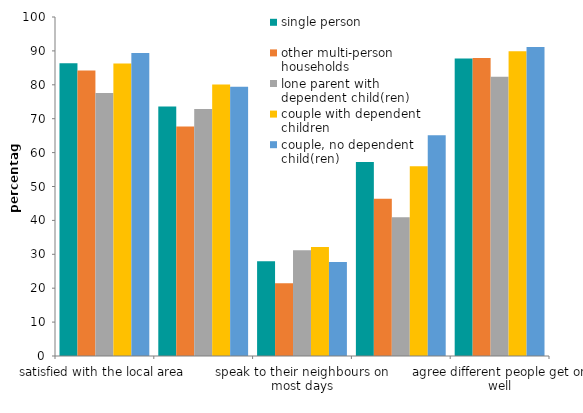
| Category | single person | other multi-person households | lone parent with dependent child(ren)  | couple with dependent children | couple, no dependent child(ren) |
|---|---|---|---|---|---|
| satisfied with the local area | 86.344 | 84.244 | 77.593 | 86.293 | 89.354 |
| feel they belong to the neighbourhood | 73.603 | 67.692 | 72.895 | 80.065 | 79.406 |
| speak to their neighbours on most days | 27.976 | 21.496 | 31.224 | 32.121 | 27.722 |
| feel most people can be trusted | 57.242 | 46.387 | 40.937 | 55.968 | 65.1 |
| agree different people get on well | 87.749 | 87.888 | 82.34 | 89.914 | 91.164 |